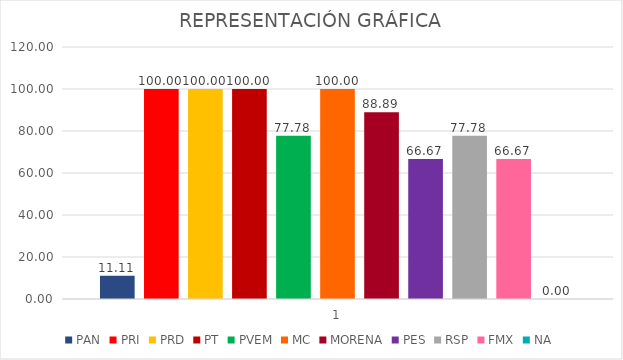
| Category | PAN | PRI | PRD | PT | PVEM | MC | MORENA | PES | RSP | FMX | NA |
|---|---|---|---|---|---|---|---|---|---|---|---|
| 0 | 11.111 | 100 | 100 | 100 | 77.778 | 100 | 88.889 | 66.667 | 77.778 | 66.667 | 0 |